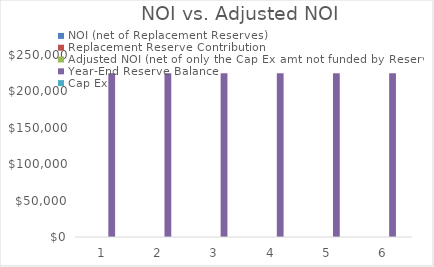
| Category | NOI (net of Replacement Reserves) | Replacement Reserve Contribution | Adjusted NOI (net of only the Cap Ex amt not funded by Reserves) | Year-End Reserve Balance | Cap Ex |
|---|---|---|---|---|---|
| 0 |  | 0 | 0 | 225000 | 0 |
| 1 |  | 0 | 0 | 225000 | 0 |
| 2 |  | 0 | 0 | 225000 | 0 |
| 3 |  | 0 | 0 | 225000 | 0 |
| 4 |  | 0 | 0 | 225000 | 0 |
| 5 |  | 0 | 0 | 225000 | 0 |